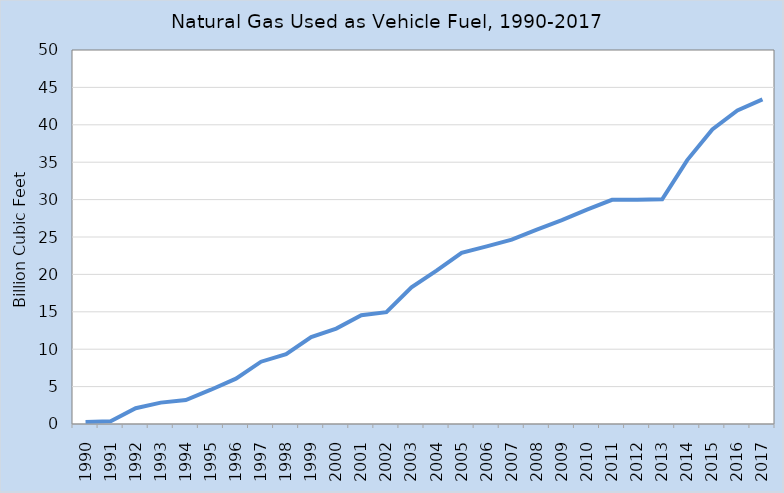
| Category | Series 0 |
|---|---|
| 1990.0 | 0.27 |
| 1991.0 | 0.367 |
| 1992.0 | 2.112 |
| 1993.0 | 2.86 |
| 1994.0 | 3.207 |
| 1995.0 | 4.585 |
| 1996.0 | 6.067 |
| 1997.0 | 8.328 |
| 1998.0 | 9.341 |
| 1999.0 | 11.622 |
| 2000.0 | 12.752 |
| 2001.0 | 14.536 |
| 2002.0 | 14.95 |
| 2003.0 | 18.271 |
| 2004.0 | 20.514 |
| 2005.0 | 22.884 |
| 2006.0 | 23.739 |
| 2007.0 | 24.655 |
| 2008.0 | 25.982 |
| 2009.0 | 27.262 |
| 2010.0 | 28.664 |
| 2011.0 | 29.974 |
| 2012.0 | 29.97 |
| 2013.0 | 30.045 |
| 2014.0 | 35.282 |
| 2015.0 | 39.39 |
| 2016.0 | 41.919 |
| 2017.0 | 43.405 |